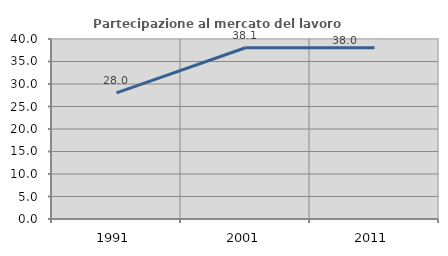
| Category | Partecipazione al mercato del lavoro  femminile |
|---|---|
| 1991.0 | 28.037 |
| 2001.0 | 38.051 |
| 2011.0 | 38.037 |